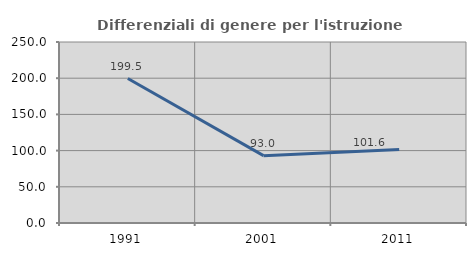
| Category | Differenziali di genere per l'istruzione superiore |
|---|---|
| 1991.0 | 199.52 |
| 2001.0 | 93.013 |
| 2011.0 | 101.649 |